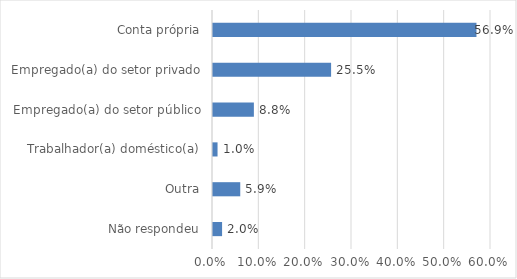
| Category | Series 0 |
|---|---|
| Não respondeu | 0.02 |
| Outra | 0.059 |
| Trabalhador(a) doméstico(a) | 0.01 |
| Empregado(a) do setor público | 0.088 |
| Empregado(a) do setor privado | 0.255 |
| Conta própria | 0.569 |